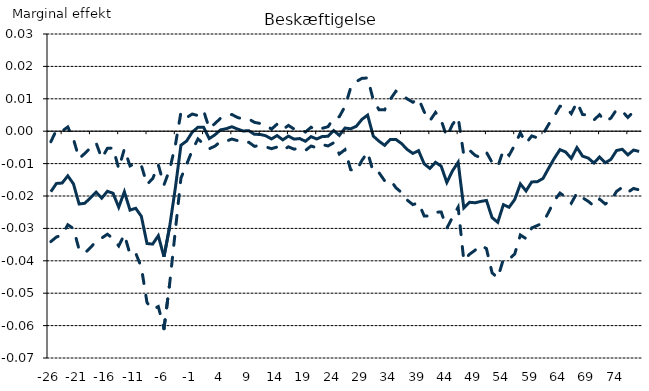
| Category | Estimat | Nedre konfidensgrænse | Øvre konfidensgrænse |
|---|---|---|---|
| -26.0 | -0.019 | -0.034 | -0.003 |
| -25.0 | -0.016 | -0.033 | 0 |
| -24.0 | -0.016 | -0.032 | 0 |
| -23.0 | -0.014 | -0.029 | 0.001 |
| -22.0 | -0.016 | -0.03 | -0.002 |
| -21.0 | -0.022 | -0.037 | -0.008 |
| -20.0 | -0.022 | -0.038 | -0.007 |
| -19.0 | -0.021 | -0.036 | -0.005 |
| -18.0 | -0.019 | -0.034 | -0.004 |
| -17.0 | -0.021 | -0.033 | -0.008 |
| -16.0 | -0.019 | -0.032 | -0.005 |
| -15.0 | -0.019 | -0.033 | -0.005 |
| -14.0 | -0.023 | -0.035 | -0.012 |
| -13.0 | -0.019 | -0.032 | -0.006 |
| -12.0 | -0.024 | -0.038 | -0.011 |
| -11.0 | -0.024 | -0.038 | -0.01 |
| -10.0 | -0.026 | -0.042 | -0.011 |
| -9.0 | -0.035 | -0.053 | -0.016 |
| -8.0 | -0.035 | -0.055 | -0.015 |
| -7.0 | -0.032 | -0.054 | -0.01 |
| -6.0 | -0.039 | -0.061 | -0.017 |
| -5.0 | -0.03 | -0.047 | -0.012 |
| -4.0 | -0.018 | -0.031 | -0.004 |
| -3.0 | -0.004 | -0.014 | 0.006 |
| -2.0 | -0.003 | -0.01 | 0.004 |
| -1.0 | 0 | -0.006 | 0.005 |
| 0.0 | 0.001 | -0.002 | 0.005 |
| 1.0 | 0.001 | -0.004 | 0.006 |
| 2.0 | -0.002 | -0.005 | 0.001 |
| 3.0 | -0.001 | -0.005 | 0.002 |
| 4.0 | 0 | -0.003 | 0.004 |
| 5.0 | 0.001 | -0.003 | 0.005 |
| 6.0 | 0.001 | -0.002 | 0.005 |
| 7.0 | 0.001 | -0.003 | 0.004 |
| 8.0 | 0 | -0.004 | 0.004 |
| 9.0 | 0 | -0.003 | 0.004 |
| 10.0 | -0.001 | -0.005 | 0.003 |
| 11.0 | -0.001 | -0.004 | 0.002 |
| 12.0 | -0.001 | -0.005 | 0.002 |
| 13.0 | -0.002 | -0.005 | 0.001 |
| 14.0 | -0.001 | -0.005 | 0.002 |
| 15.0 | -0.003 | -0.006 | 0.001 |
| 16.0 | -0.002 | -0.005 | 0.002 |
| 17.0 | -0.002 | -0.006 | 0.001 |
| 18.0 | -0.002 | -0.005 | 0.001 |
| 19.0 | -0.003 | -0.006 | 0 |
| 20.0 | -0.002 | -0.005 | 0.001 |
| 21.0 | -0.002 | -0.005 | 0 |
| 22.0 | -0.002 | -0.004 | 0.001 |
| 23.0 | -0.002 | -0.005 | 0.001 |
| 24.0 | 0 | -0.004 | 0.004 |
| 25.0 | -0.001 | -0.007 | 0.004 |
| 26.0 | 0.001 | -0.006 | 0.008 |
| 27.0 | 0.001 | -0.012 | 0.013 |
| 28.0 | 0.002 | -0.012 | 0.015 |
| 29.0 | 0.004 | -0.009 | 0.016 |
| 30.0 | 0.005 | -0.006 | 0.016 |
| 31.0 | -0.002 | -0.013 | 0.01 |
| 32.0 | -0.003 | -0.013 | 0.007 |
| 33.0 | -0.004 | -0.015 | 0.007 |
| 34.0 | -0.003 | -0.015 | 0.01 |
| 35.0 | -0.003 | -0.017 | 0.012 |
| 36.0 | -0.004 | -0.019 | 0.011 |
| 37.0 | -0.006 | -0.021 | 0.01 |
| 38.0 | -0.007 | -0.023 | 0.009 |
| 39.0 | -0.006 | -0.022 | 0.01 |
| 40.0 | -0.01 | -0.026 | 0.006 |
| 41.0 | -0.011 | -0.026 | 0.003 |
| 42.0 | -0.01 | -0.025 | 0.006 |
| 43.0 | -0.011 | -0.025 | 0.003 |
| 44.0 | -0.016 | -0.03 | -0.002 |
| 45.0 | -0.012 | -0.027 | 0.002 |
| 46.0 | -0.01 | -0.023 | 0.004 |
| 47.0 | -0.024 | -0.04 | -0.007 |
| 48.0 | -0.022 | -0.038 | -0.006 |
| 49.0 | -0.022 | -0.037 | -0.007 |
| 50.0 | -0.022 | -0.035 | -0.008 |
| 51.0 | -0.021 | -0.036 | -0.007 |
| 52.0 | -0.027 | -0.044 | -0.01 |
| 53.0 | -0.028 | -0.045 | -0.011 |
| 54.0 | -0.023 | -0.039 | -0.006 |
| 55.0 | -0.023 | -0.04 | -0.007 |
| 56.0 | -0.021 | -0.038 | -0.004 |
| 57.0 | -0.016 | -0.032 | -0.001 |
| 58.0 | -0.018 | -0.033 | -0.004 |
| 59.0 | -0.016 | -0.03 | -0.001 |
| 60.0 | -0.016 | -0.029 | -0.002 |
| 61.0 | -0.015 | -0.028 | -0.001 |
| 62.0 | -0.011 | -0.025 | 0.002 |
| 63.0 | -0.008 | -0.021 | 0.005 |
| 64.0 | -0.006 | -0.019 | 0.008 |
| 65.0 | -0.006 | -0.02 | 0.007 |
| 66.0 | -0.008 | -0.022 | 0.005 |
| 67.0 | -0.005 | -0.019 | 0.009 |
| 68.0 | -0.008 | -0.021 | 0.005 |
| 69.0 | -0.008 | -0.022 | 0.005 |
| 70.0 | -0.01 | -0.023 | 0.003 |
| 71.0 | -0.008 | -0.021 | 0.005 |
| 72.0 | -0.01 | -0.022 | 0.003 |
| 73.0 | -0.009 | -0.021 | 0.004 |
| 74.0 | -0.006 | -0.019 | 0.007 |
| 75.0 | -0.006 | -0.017 | 0.006 |
| 76.0 | -0.007 | -0.019 | 0.004 |
| 77.0 | -0.006 | -0.018 | 0.006 |
| 78.0 | -0.006 | -0.018 | 0.006 |